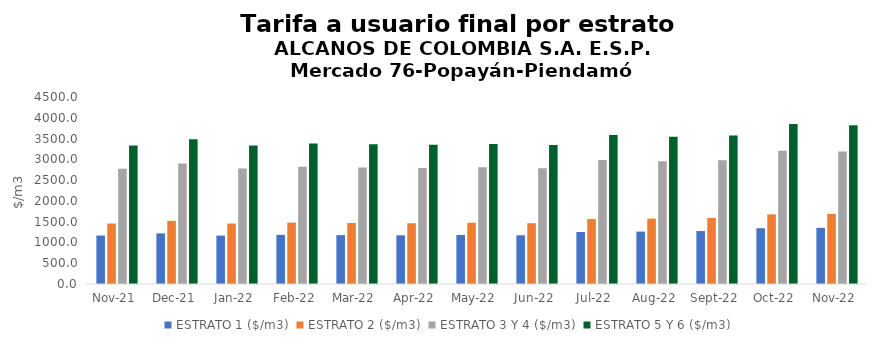
| Category | ESTRATO 1 ($/m3) | ESTRATO 2 ($/m3) | ESTRATO 3 Y 4 ($/m3) | ESTRATO 5 Y 6 ($/m3) |
|---|---|---|---|---|
| 2021-11-01 | 1166.33 | 1455.42 | 2775.81 | 3330.972 |
| 2021-12-01 | 1217.71 | 1520.34 | 2902.39 | 3482.868 |
| 2022-01-01 | 1165.24 | 1454.81 | 2778.76 | 3334.512 |
| 2022-02-01 | 1183.47 | 1477.36 | 2818.77 | 3382.524 |
| 2022-03-01 | 1176.21 | 1468.38 | 2801.57 | 3361.884 |
| 2022-04-01 | 1171.36 | 1462.31 | 2791.83 | 3350.196 |
| 2022-05-01 | 1180.61 | 1473.74 | 2808.77 | 3370.524 |
| 2022-06-01 | 1172.01 | 1463.23 | 2787.21 | 3344.652 |
| 2022-07-01 | 1250.9 | 1561.56 | 2986.65 | 3583.98 |
| 2022-08-01 | 1261.02 | 1574.02 | 2951.9 | 3542.28 |
| 2022-09-01 | 1273.99 | 1590.22 | 2979.32 | 3575.184 |
| 2022-10-01 | 1341.42 | 1674.98 | 3208.12 | 3849.744 |
| 2022-11-01 | 1350.95 | 1687.14 | 3185.9 | 3823.08 |